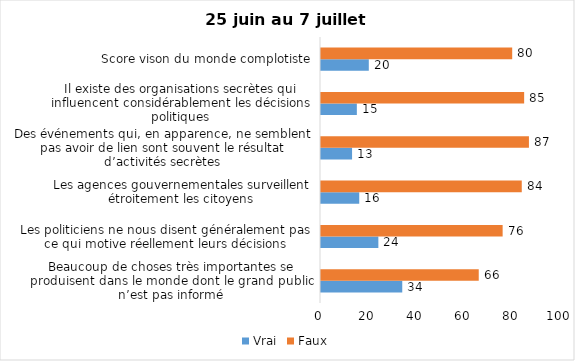
| Category | Vrai | Faux |
|---|---|---|
| Beaucoup de choses très importantes se produisent dans le monde dont le grand public n’est pas informé | 34 | 66 |
| Les politiciens ne nous disent généralement pas ce qui motive réellement leurs décisions | 24 | 76 |
| Les agences gouvernementales surveillent étroitement les citoyens | 16 | 84 |
| Des événements qui, en apparence, ne semblent pas avoir de lien sont souvent le résultat d’activités secrètes | 13 | 87 |
| Il existe des organisations secrètes qui influencent considérablement les décisions politiques | 15 | 85 |
| Score vison du monde complotiste | 20 | 80 |